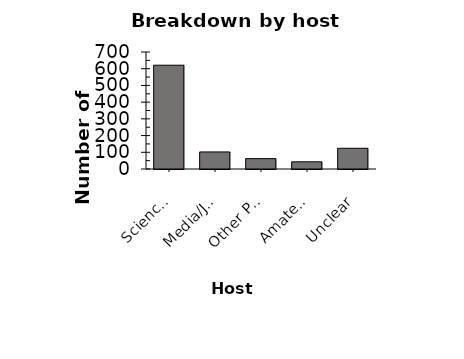
| Category | blah |
|---|---|
| Science Researcher/Educator | 621 |
| Media/Journalism Professional | 102 |
| Other Professional | 62 |
| Amateur | 43 |
| Unclear | 124 |